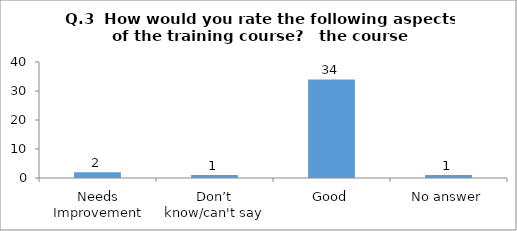
| Category | Q.3  How would you rate the following aspects of the training course?  |
|---|---|
| Needs Improvement | 2 |
| Don’t know/can't say | 1 |
| Good | 34 |
| No answer | 1 |